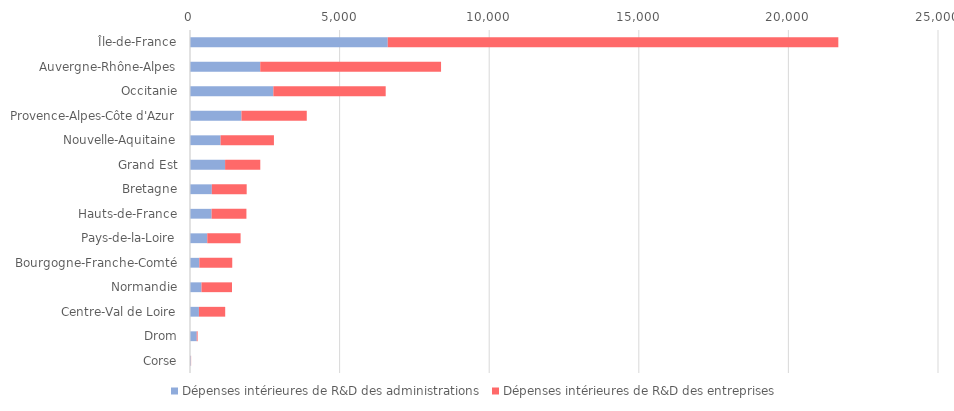
| Category | Dépenses intérieures de R&D des administrations | Dépenses intérieures de R&D des entreprises |
|---|---|---|
| Île-de-France | 6610 | 15058.6 |
| Auvergne-Rhône-Alpes | 2348 | 6042.7 |
| Occitanie | 2786 | 3754.7 |
| Provence-Alpes-Côte d'Azur | 1720 | 2182.6 |
| Nouvelle-Aquitaine | 1023 | 1782.3 |
| Grand Est | 1173 | 1176.2 |
| Bretagne | 730 | 1164.7 |
| Hauts-de-France | 723 | 1163 |
| Pays-de-la-Loire | 577 | 1114 |
| Bourgogne-Franche-Comté | 312 | 1099.9 |
| Normandie | 384 | 1020.2 |
| Centre-Val de Loire | 298 | 878.5 |
| Drom | 225 | 29.4 |
| Corse | 26 | 10.7 |